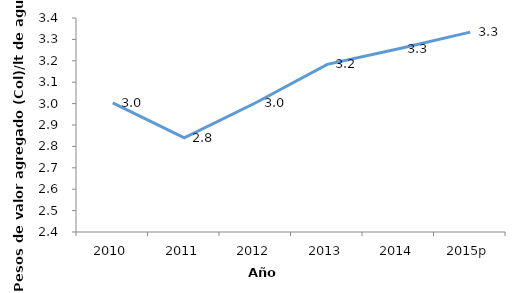
| Category | Productividad Hídrica (VA/lt)1 |
|---|---|
| 2010 | 3.004 |
| 2011 | 2.84 |
| 2012 | 3.004 |
| 2013 | 3.183 |
| 2014 | 3.256 |
| 2015p | 3.334 |